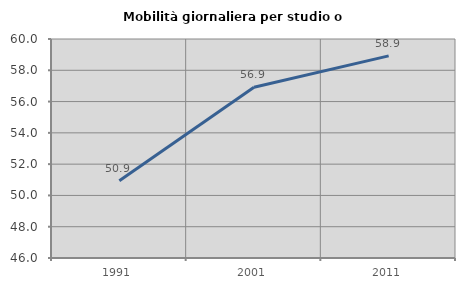
| Category | Mobilità giornaliera per studio o lavoro |
|---|---|
| 1991.0 | 50.933 |
| 2001.0 | 56.914 |
| 2011.0 | 58.92 |